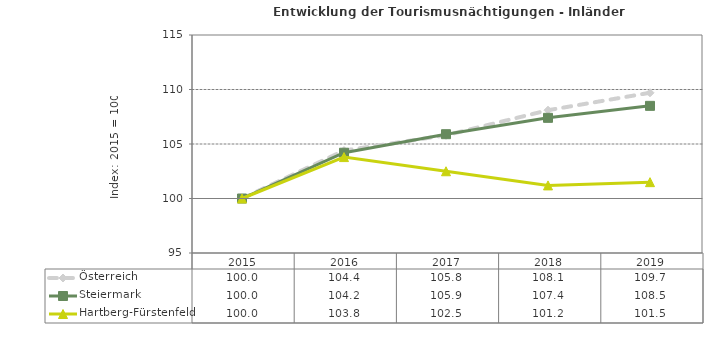
| Category | Österreich | Steiermark | Hartberg-Fürstenfeld |
|---|---|---|---|
| 2019.0 | 109.7 | 108.5 | 101.5 |
| 2018.0 | 108.1 | 107.4 | 101.2 |
| 2017.0 | 105.8 | 105.9 | 102.5 |
| 2016.0 | 104.4 | 104.2 | 103.8 |
| 2015.0 | 100 | 100 | 100 |